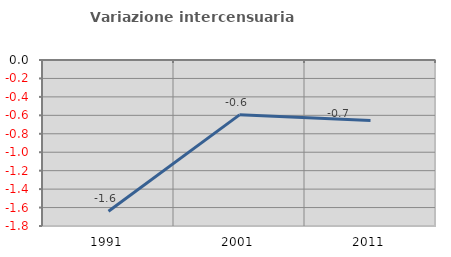
| Category | Variazione intercensuaria annua |
|---|---|
| 1991.0 | -1.64 |
| 2001.0 | -0.595 |
| 2011.0 | -0.655 |